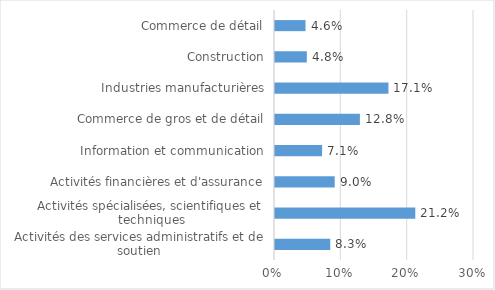
| Category | Series 0 |
|---|---|
| Activités des services administratifs et de soutien | 0.083 |
| Activités spécialisées, scientifiques et techniques | 0.212 |
| Activités financières et d'assurance | 0.09 |
| Information et communication | 0.071 |
| Commerce de gros et de détail | 0.128 |
| Industries manufacturières | 0.171 |
| Construction | 0.048 |
| Commerce de détail | 0.046 |